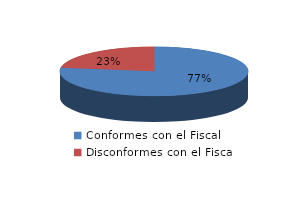
| Category | Series 0 |
|---|---|
| 0 | 65 |
| 1 | 19 |